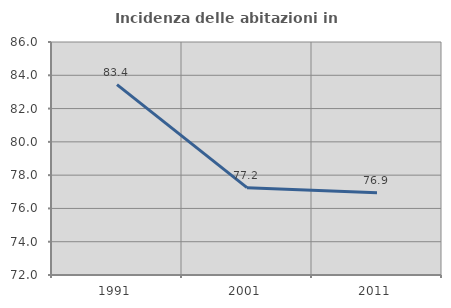
| Category | Incidenza delle abitazioni in proprietà  |
|---|---|
| 1991.0 | 83.436 |
| 2001.0 | 77.247 |
| 2011.0 | 76.944 |